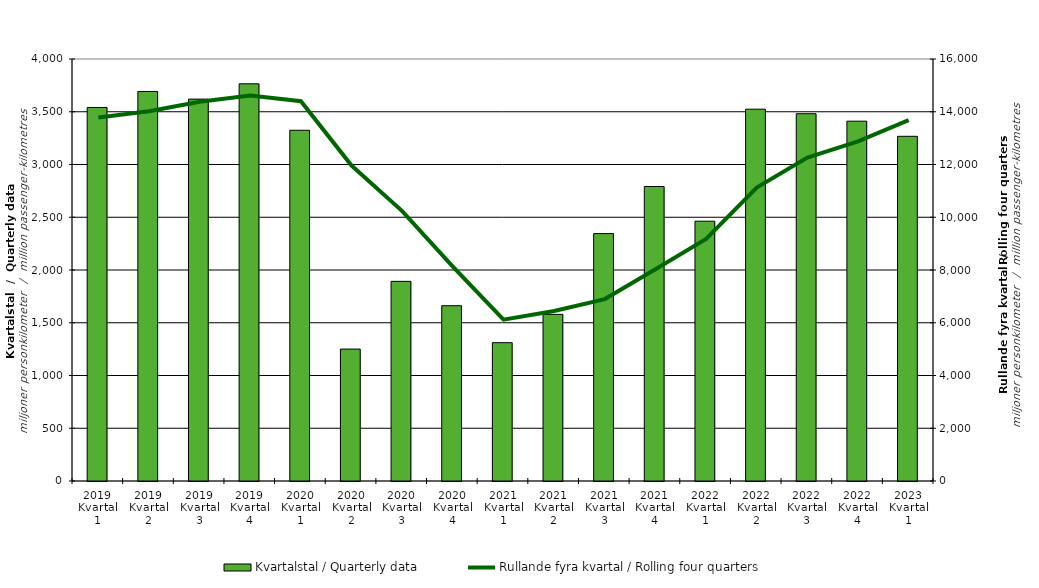
| Category | Kvartalstal / Quarterly data |
|---|---|
| 2019 Kvartal 1 | 3540.48 |
| 2019 Kvartal 2 | 3692.248 |
| 2019 Kvartal 3 | 3619.721 |
| 2019 Kvartal 4 | 3764.759 |
| 2020 Kvartal 1 | 3324.383 |
| 2020 Kvartal 2 | 1250.488 |
| 2020 Kvartal 3 | 1892.351 |
| 2020 Kvartal 4 | 1661.523 |
| 2021 Kvartal 1 | 1311.197 |
| 2021 Kvartal 2 | 1579.614 |
| 2021 Kvartal 3 | 2345.169 |
| 2021 Kvartal 4 | 2791.509 |
| 2022 Kvartal 1 | 2462.735 |
| 2022 Kvartal 2 | 3524.434 |
| 2022 Kvartal 3 | 3481.38 |
| 2022 Kvartal 4 | 3410.614 |
| 2023 Kvartal 1 | 3267.284 |